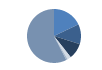
| Category | Series 0 |
|---|---|
| ARRASTRE | 236 |
| CERCO | 157 |
| PALANGRE | 125 |
| REDES DE ENMALLE | 29 |
| ARTES FIJAS | 12 |
| ARTES MENORES | 757 |